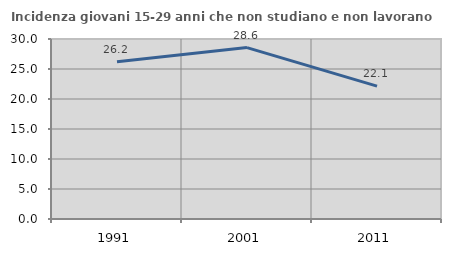
| Category | Incidenza giovani 15-29 anni che non studiano e non lavorano  |
|---|---|
| 1991.0 | 26.206 |
| 2001.0 | 28.571 |
| 2011.0 | 22.137 |